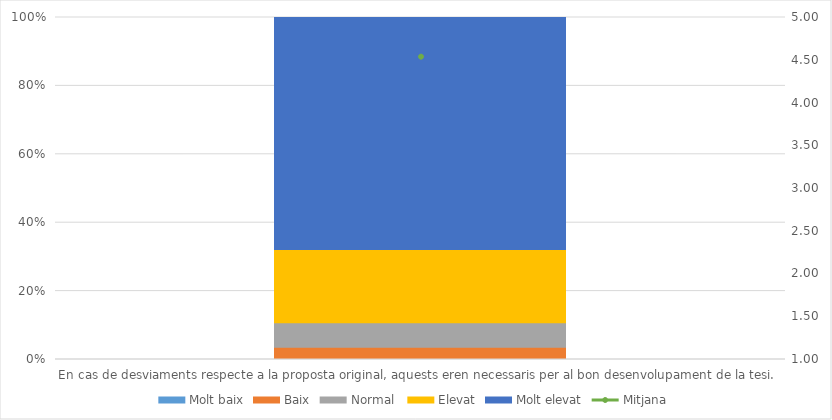
| Category | Molt baix | Baix | Normal  | Elevat | Molt elevat |
|---|---|---|---|---|---|
| En cas de desviaments respecte a la proposta original, aquests eren necessaris per al bon desenvolupament de la tesi. | 0 | 1 | 2 | 6 | 19 |